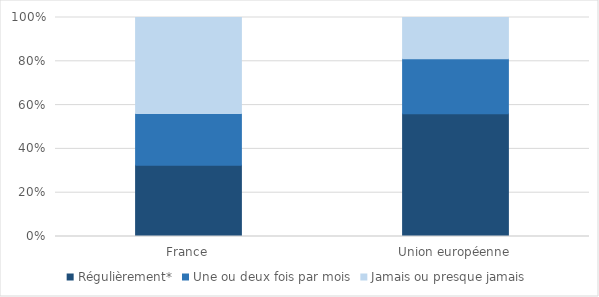
| Category | Régulièrement* | Une ou deux fois par mois | Jamais ou presque jamais |
|---|---|---|---|
| France | 32.5 | 23.644 | 43.829 |
| Union européenne | 56.1 | 25.1 | 18.8 |